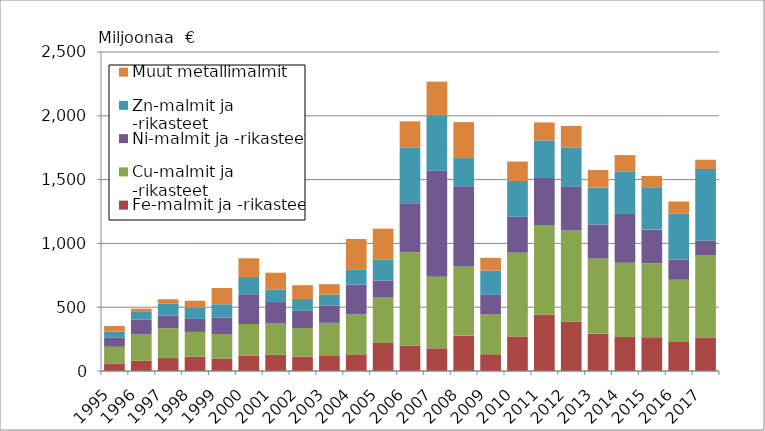
| Category | Fe-malmit ja -rikasteet | Cu-malmit ja -rikasteet | Ni-malmit ja -rikasteet | Zn-malmit ja -rikasteet | Muut metallimalmit |
|---|---|---|---|---|---|
| 1995.0 | 59489 | 130415 | 73508 | 44944 | 44598 |
| 1996.0 | 79860 | 206503 | 116936 | 59525 | 25992 |
| 1997.0 | 101234 | 233159 | 98587 | 94164 | 34979 |
| 1998.0 | 111544 | 194928 | 101754 | 86070 | 56441 |
| 1999.0 | 98240 | 191552 | 129950 | 103397 | 127290 |
| 2000.0 | 119304 | 249218 | 233071 | 135854 | 145736 |
| 2001.0 | 126874 | 245255 | 168125 | 98505 | 131345 |
| 2002.0 | 113455 | 223230 | 134744 | 93407 | 107687 |
| 2003.0 | 117688 | 259557 | 135911 | 84828 | 82226 |
| 2004.0 | 130459 | 313172 | 233547 | 115721 | 241699 |
| 2005.0 | 219439 | 355190 | 134593 | 162035 | 244453 |
| 2006.0 | 199751 | 731232 | 384026 | 433255 | 208475 |
| 2007.0 | 177725 | 561860 | 830577 | 434486 | 263261 |
| 2008.0 | 277823 | 540256 | 630041 | 220619 | 281832 |
| 2009.0 | 131307 | 311283 | 154153 | 189991 | 100405 |
| 2010.0 | 270614.05 | 657398.191 | 280406.513 | 281130.299 | 151763 |
| 2011.0 | 439967 | 704840 | 367501 | 295591 | 140253 |
| 2012.0 | 387423 | 713133 | 342571 | 309618 | 167842 |
| 2013.0 | 293288 | 586889 | 268224 | 288989 | 138131 |
| 2014.0 | 266241 | 581999 | 381451 | 336082 | 126128 |
| 2015.0 | 264774 | 580075 | 263132 | 331894 | 88918 |
| 2016.0 | 227787 | 487366 | 157983 | 360737 | 94455 |
| 2017.0 | 263243 | 642940 | 114869 | 561954 | 72535 |